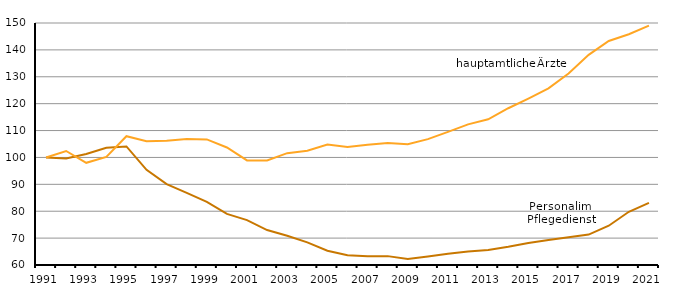
| Category | Personal im Pflegedienst | hauptamtliche Ärzte |
|---|---|---|
| 1991.0 | 100 | 100 |
| 1992.0 | 99.6 | 102.4 |
| 1993.0 | 101.3 | 98 |
| 1994.0 | 103.6 | 100.2 |
| 1995.0 | 104.1 | 107.9 |
| 1996.0 | 95.4 | 106 |
| 1997.0 | 90.1 | 106.2 |
| 1998.0 | 86.8 | 106.9 |
| 1999.0 | 83.5 | 106.7 |
| 2000.0 | 79 | 103.7 |
| 2001.0 | 76.7 | 98.9 |
| 2002.0 | 73 | 98.9 |
| 2003.0 | 70.9 | 101.6 |
| 2004.0 | 68.4 | 102.5 |
| 2005.0 | 65.3 | 104.8 |
| 2006.0 | 63.6 | 103.9 |
| 2007.0 | 63.3 | 104.7 |
| 2008.0 | 63.3 | 105.4 |
| 2009.0 | 62.2 | 104.9 |
| 2010.0 | 63.2 | 106.8 |
| 2011.0 | 64.2 | 109.5 |
| 2012.0 | 65 | 112.3 |
| 2013.0 | 65.6 | 114.2 |
| 2014.0 | 66.8 | 118.3 |
| 2015.0 | 68.2 | 121.9 |
| 2016.0 | 69.3 | 125.7 |
| 2017.0 | 70.3 | 131.2 |
| 2018.0 | 71.3 | 138.142 |
| 2019.0 | 74.6 | 143.3 |
| 2020.0 | 79.8 | 145.8 |
| 2021.0 | 83.1 | 149 |